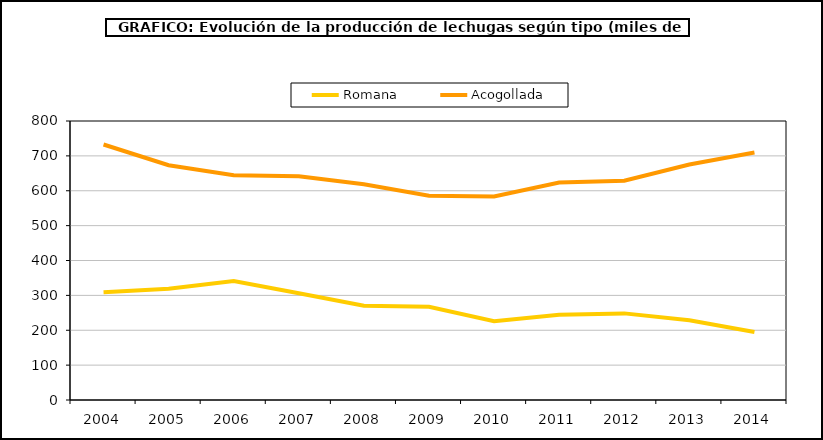
| Category | Romana | Acogollada |
|---|---|---|
| 2004.0 | 308.969 | 732.654 |
| 2005.0 | 318.774 | 673.099 |
| 2006.0 | 341.254 | 644.607 |
| 2007.0 | 306.019 | 641.593 |
| 2008.0 | 270.572 | 618.661 |
| 2009.0 | 267.562 | 585.426 |
| 2010.0 | 225.829 | 583.561 |
| 2011.0 | 244.577 | 623.859 |
| 2012.0 | 248.374 | 628.552 |
| 2013.0 | 228.928 | 675.355 |
| 2014.0 | 195.068 | 709.734 |